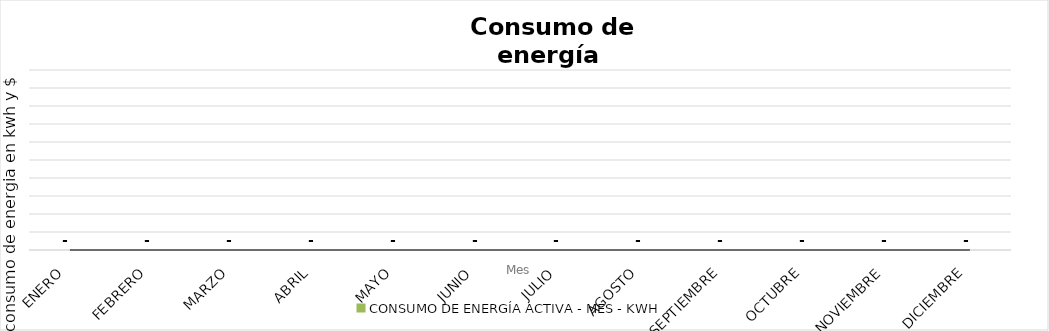
| Category | CONSUMO DE ENERGÍA ACTIVA - MES - KWH |
|---|---|
|  ENERO  | 0 |
|  FEBRERO  | 0 |
|  MARZO  | 0 |
|  ABRIL  | 0 |
|  MAYO  | 0 |
|  JUNIO  | 0 |
|  JULIO  | 0 |
|  AGOSTO  | 0 |
|  SEPTIEMBRE  | 0 |
|  OCTUBRE  | 0 |
|  NOVIEMBRE  | 0 |
|  DICIEMBRE  | 0 |